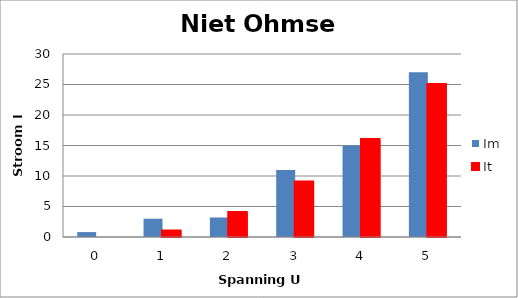
| Category | Im | It |
|---|---|---|
| 0.0 | 0.8 | 0 |
| 1.0 | 3 | 1 |
| 2.0 | 3.2 | 4 |
| 3.0 | 11 | 9 |
| 4.0 | 15 | 16 |
| 5.0 | 27 | 25 |